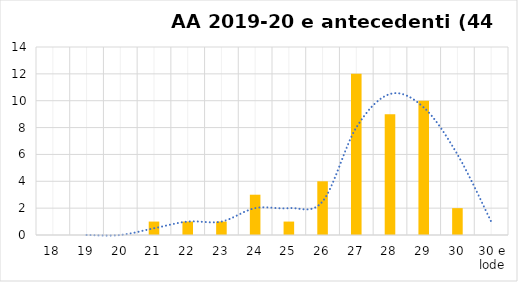
| Category | Series 0 |
|---|---|
| 18 | 0 |
| 19 | 0 |
| 20 | 0 |
| 21 | 1 |
| 22 | 1 |
| 23 | 1 |
| 24 | 3 |
| 25 | 1 |
| 26 | 4 |
| 27 | 12 |
| 28 | 9 |
| 29 | 10 |
| 30 | 2 |
| 30 e lode | 0 |